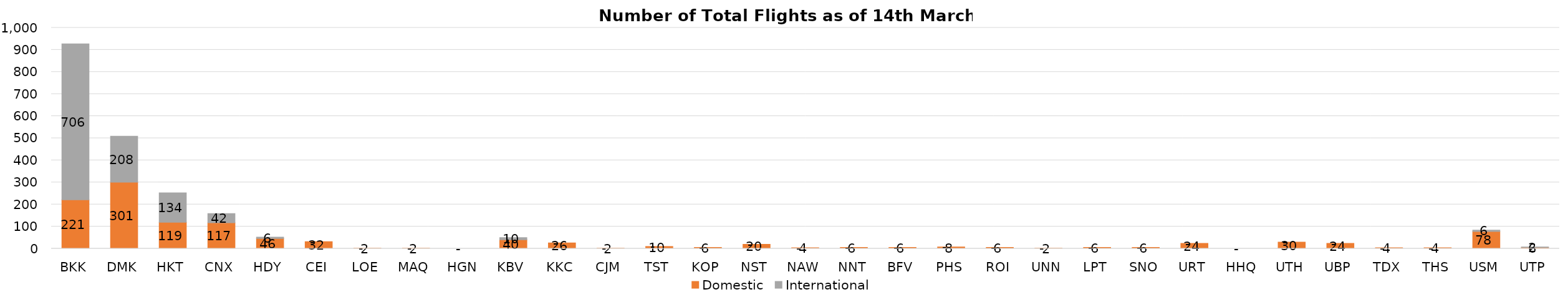
| Category | Domestic | International |
|---|---|---|
| BKK | 221 | 706 |
| DMK | 301 | 208 |
| HKT | 119 | 134 |
| CNX | 117 | 42 |
| HDY | 46 | 6 |
| CEI | 32 | 0 |
| LOE | 2 | 0 |
| MAQ | 2 | 0 |
| HGN | 0 | 0 |
| KBV | 40 | 10 |
| KKC | 26 | 0 |
| CJM | 2 | 0 |
| TST | 10 | 0 |
| KOP | 6 | 0 |
| NST | 20 | 0 |
| NAW | 4 | 0 |
| NNT | 6 | 0 |
| BFV | 6 | 0 |
| PHS | 8 | 0 |
| ROI | 6 | 0 |
| UNN | 2 | 0 |
| LPT | 6 | 0 |
| SNO | 6 | 0 |
| URT | 24 | 0 |
| HHQ | 0 | 0 |
| UTH | 30 | 0 |
| UBP | 24 | 0 |
| TDX | 4 | 0 |
| THS | 4 | 0 |
| USM | 78 | 6 |
| UTP | 6 | 2 |